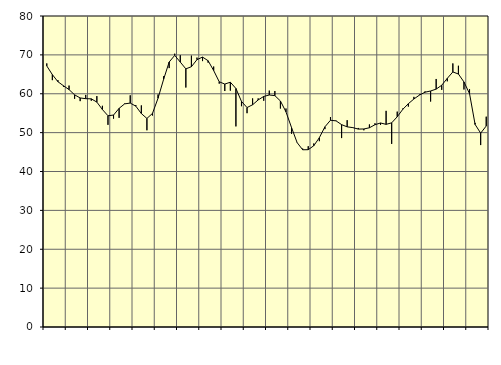
| Category | Piggar | Series 1 |
|---|---|---|
| nan | 67.8 | 67.15 |
| 1.0 | 63.5 | 64.92 |
| 1.0 | 63.5 | 63.1 |
| 1.0 | 61.8 | 62.05 |
| nan | 62.1 | 61.07 |
| 2.0 | 58.7 | 59.72 |
| 2.0 | 58.1 | 58.92 |
| 2.0 | 59.7 | 58.73 |
| nan | 58.2 | 58.69 |
| 3.0 | 59.4 | 57.85 |
| 3.0 | 56.9 | 55.94 |
| 3.0 | 52 | 54.34 |
| nan | 53.6 | 54.52 |
| 4.0 | 53.8 | 56.25 |
| 4.0 | 57.5 | 57.4 |
| 4.0 | 59.6 | 57.6 |
| nan | 57.1 | 56.82 |
| 5.0 | 57 | 54.9 |
| 5.0 | 50.6 | 53.65 |
| 5.0 | 54.4 | 54.94 |
| nan | 59.8 | 58.85 |
| 6.0 | 64.5 | 63.7 |
| 6.0 | 66.6 | 68.16 |
| 6.0 | 70.3 | 69.87 |
| nan | 69.9 | 68.14 |
| 7.0 | 61.6 | 66.4 |
| 7.0 | 69.8 | 66.96 |
| 7.0 | 69.3 | 68.77 |
| nan | 68.4 | 69.43 |
| 8.0 | 68 | 68.5 |
| 8.0 | 67 | 65.97 |
| 8.0 | 62.6 | 63.08 |
| nan | 60.7 | 62.49 |
| 9.0 | 60.8 | 62.97 |
| 9.0 | 51.6 | 61.36 |
| 9.0 | 56.8 | 58.03 |
| nan | 55 | 56.45 |
| 10.0 | 58.8 | 57.17 |
| 10.0 | 58.8 | 58.41 |
| 10.0 | 58.2 | 59.31 |
| nan | 60.8 | 59.68 |
| 11.0 | 60.7 | 59.52 |
| 11.0 | 56.2 | 58.14 |
| 11.0 | 56.2 | 55.34 |
| nan | 49.7 | 51.3 |
| 12.0 | 47.5 | 47.44 |
| 12.0 | 45.9 | 45.59 |
| 12.0 | 46.5 | 45.61 |
| nan | 47.2 | 46.63 |
| 13.0 | 47.8 | 48.7 |
| 13.0 | 50.9 | 51.49 |
| 13.0 | 54 | 53.18 |
| nan | 53.1 | 53.03 |
| 14.0 | 48.6 | 52.05 |
| 14.0 | 53.2 | 51.49 |
| 14.0 | 51.2 | 51.29 |
| nan | 51.2 | 50.91 |
| 15.0 | 50.6 | 50.94 |
| 15.0 | 52.1 | 51.25 |
| 15.0 | 52.4 | 52.03 |
| nan | 52 | 52.48 |
| 16.0 | 55.6 | 52.13 |
| 16.0 | 47.1 | 52.52 |
| 16.0 | 55.4 | 54.07 |
| nan | 56.2 | 55.99 |
| 17.0 | 56.7 | 57.44 |
| 17.0 | 59.2 | 58.65 |
| 17.0 | 59.8 | 59.66 |
| nan | 60.6 | 60.4 |
| 18.0 | 58 | 60.71 |
| 18.0 | 63.8 | 61.19 |
| 18.0 | 61 | 62.19 |
| nan | 63.2 | 63.96 |
| 19.0 | 67.8 | 65.61 |
| 19.0 | 67.2 | 65.08 |
| 19.0 | 61.1 | 63.03 |
| nan | 61.2 | 60.03 |
| 20.0 | 52.5 | 52.1 |
| 20.0 | 46.8 | 49.87 |
| 20.0 | 54.1 | 51.7 |